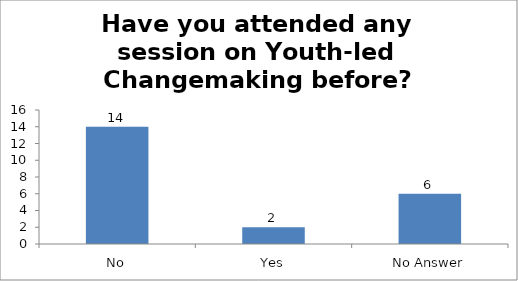
| Category | Have you attended any session on Youth-led Changemaking before? |
|---|---|
| No | 14 |
| Yes | 2 |
| No Answer | 6 |